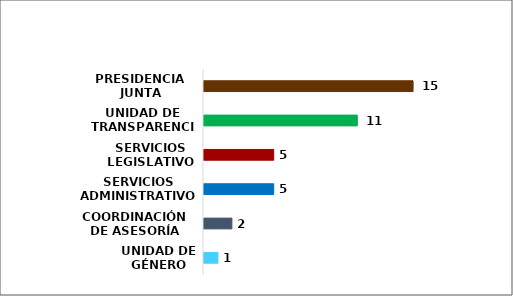
| Category | Series 0 |
|---|---|
| UNIDAD DE GÉNERO | 1 |
| COORDINACIÓN DE ASESORÍA | 2 |
| SERVICIOS ADMINISTRATIVOS | 5 |
| SERVICIOS LEGISLATIVOS | 5 |
| UNIDAD DE TRANSPARENCIA | 11 |
| PRESIDENCIA JUNTA GOBIERNO | 15 |